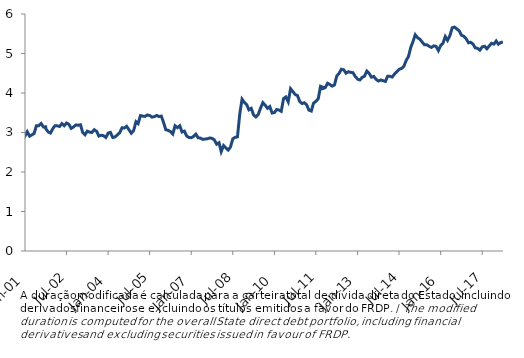
| Category | Series 0 |
|---|---|
| 2001-01-31 | 2.946 |
| 2001-02-01 | 2.916 |
| 2001-03-01 | 3.02 |
| 2001-04-01 | 2.907 |
| 2001-05-30 | 2.973 |
| 2001-06-30 | 3.172 |
| 2001-07-31 | 3.172 |
| 2001-08-31 | 3.228 |
| 2001-09-30 | 3.14 |
| 2001-10-30 | 3.143 |
| 2001-11-01 | 3.096 |
| 2001-12-01 | 3.015 |
| 2002-01-01 | 2.985 |
| 2002-02-01 | 3.098 |
| 2002-03-01 | 3.171 |
| 2002-04-01 | 3.169 |
| 2002-05-01 | 3.152 |
| 2002-06-01 | 3.227 |
| 2002-07-01 | 3.172 |
| 2002-08-01 | 3.24 |
| 2002-09-01 | 3.207 |
| 2002-10-01 | 3.104 |
| 2002-11-01 | 3.141 |
| 2002-12-01 | 3.19 |
| 2003-01-01 | 3.184 |
| 2003-02-01 | 3.196 |
| 2003-03-01 | 3.006 |
| 2003-04-01 | 2.942 |
| 2003-05-01 | 3.035 |
| 2003-06-01 | 3.009 |
| 2003-07-01 | 3 |
| 2003-08-01 | 3.071 |
| 2003-09-01 | 3.03 |
| 2003-10-01 | 2.91 |
| 2003-11-01 | 2.931 |
| 2003-12-01 | 2.918 |
| 2004-01-01 | 2.873 |
| 2004-02-01 | 2.986 |
| 2004-03-01 | 3.003 |
| 2004-04-01 | 2.873 |
| 2004-05-01 | 2.887 |
| 2004-06-01 | 2.94 |
| 2004-07-01 | 2.993 |
| 2004-08-01 | 3.119 |
| 2004-09-01 | 3.114 |
| 2004-10-01 | 3.157 |
| 2004-11-01 | 3.067 |
| 2004-12-01 | 2.981 |
| 2005-01-01 | 3.047 |
| 2005-02-01 | 3.274 |
| 2005-03-01 | 3.226 |
| 2005-04-01 | 3.428 |
| 2005-05-01 | 3.415 |
| 2005-06-01 | 3.407 |
| 2005-07-01 | 3.444 |
| 2005-08-01 | 3.43 |
| 2005-09-01 | 3.389 |
| 2005-10-01 | 3.403 |
| 2005-11-01 | 3.433 |
| 2005-12-01 | 3.405 |
| 2006-01-01 | 3.415 |
| 2006-02-01 | 3.245 |
| 2006-03-01 | 3.071 |
| 2006-04-01 | 3.054 |
| 2006-05-01 | 3.025 |
| 2006-06-01 | 2.962 |
| 2006-07-01 | 3.169 |
| 2006-08-01 | 3.122 |
| 2006-09-01 | 3.17 |
| 2006-10-01 | 3.013 |
| 2006-11-01 | 3.034 |
| 2006-12-01 | 2.911 |
| 2007-01-01 | 2.872 |
| 2007-02-01 | 2.869 |
| 2007-03-01 | 2.9 |
| 2007-04-01 | 2.958 |
| 2007-05-01 | 2.867 |
| 2007-06-01 | 2.858 |
| 2007-07-01 | 2.826 |
| 2007-08-31 | 2.842 |
| 2007-09-30 | 2.862 |
| 2007-10-31 | 2.852 |
| 2007-11-30 | 2.814 |
| 2007-12-31 | 2.705 |
| 2008-01-31 | 2.742 |
| 2008-02-29 | 2.517 |
| 2008-03-31 | 2.668 |
| 2008-04-30 | 2.609 |
| 2008-05-31 | 2.555 |
| 2008-06-30 | 2.632 |
| 2008-07-31 | 2.84 |
| 2008-08-31 | 2.878 |
| 2008-09-30 | 2.889 |
| 2008-10-31 | 3.476 |
| 2008-11-30 | 3.843 |
| 2008-12-31 | 3.759 |
| 2009-01-31 | 3.702 |
| 2009-02-28 | 3.574 |
| 2009-03-31 | 3.612 |
| 2009-04-30 | 3.448 |
| 2009-05-31 | 3.396 |
| 2009-06-30 | 3.451 |
| 2009-07-31 | 3.614 |
| 2009-08-31 | 3.755 |
| 2009-09-30 | 3.694 |
| 2009-10-31 | 3.612 |
| 2009-11-30 | 3.656 |
| 2009-12-31 | 3.494 |
| 2010-01-31 | 3.505 |
| 2010-02-28 | 3.581 |
| 2010-03-31 | 3.57 |
| 2010-04-30 | 3.537 |
| 2010-05-31 | 3.86 |
| 2010-06-30 | 3.9 |
| 2010-07-31 | 3.778 |
| 2010-08-31 | 4.109 |
| 2010-09-30 | 4.038 |
| 2010-10-31 | 3.962 |
| 2010-11-30 | 3.935 |
| 2010-12-31 | 3.781 |
| 2011-01-31 | 3.733 |
| 2011-02-28 | 3.753 |
| 2011-03-31 | 3.702 |
| 2011-04-30 | 3.566 |
| 2011-05-31 | 3.543 |
| 2011-06-30 | 3.742 |
| 2011-07-31 | 3.789 |
| 2011-08-31 | 3.857 |
| 2011-09-30 | 4.17 |
| 2011-10-31 | 4.147 |
| 2011-11-01 | 4.114 |
| 2011-12-01 | 4.135 |
| 2012-01-01 | 4.247 |
| 2012-02-01 | 4.214 |
| 2012-03-01 | 4.174 |
| 2012-04-01 | 4.205 |
| 2012-05-01 | 4.43 |
| 2012-06-01 | 4.5 |
| 2012-07-01 | 4.601 |
| 2012-08-01 | 4.587 |
| 2012-09-01 | 4.5 |
| 2012-10-01 | 4.539 |
| 2012-11-01 | 4.522 |
| 2012-12-01 | 4.513 |
| 2013-01-01 | 4.415 |
| 2013-02-01 | 4.35 |
| 2013-03-01 | 4.331 |
| 2013-04-01 | 4.395 |
| 2013-05-01 | 4.426 |
| 2013-06-01 | 4.556 |
| 2013-07-01 | 4.499 |
| 2013-08-01 | 4.4 |
| 2013-09-01 | 4.419 |
| 2013-10-01 | 4.346 |
| 2013-11-01 | 4.303 |
| 2013-12-01 | 4.331 |
| 2014-01-01 | 4.312 |
| 2014-02-01 | 4.292 |
| 2014-03-01 | 4.422 |
| 2014-04-01 | 4.422 |
| 2014-05-01 | 4.404 |
| 2014-06-01 | 4.48 |
| 2014-07-01 | 4.536 |
| 2014-08-01 | 4.6 |
| 2014-09-01 | 4.621 |
| 2014-10-01 | 4.672 |
| 2014-11-01 | 4.822 |
| 2014-12-01 | 4.92 |
| 2015-01-01 | 5.154 |
| 2015-02-01 | 5.311 |
| 2015-03-01 | 5.474 |
| 2015-04-01 | 5.399 |
| 2015-05-01 | 5.362 |
| 2015-06-30 | 5.221 |
| 2015-07-31 | 5.221 |
| 2015-08-31 | 5.182 |
| 2015-09-30 | 5.153 |
| 2015-10-31 | 5.194 |
| 2015-11-30 | 5.181 |
| 2015-12-31 | 5.074 |
| 2016-01-31 | 5.208 |
| 2016-02-29 | 5.256 |
| 2016-03-31 | 5.429 |
| 2016-04-30 | 5.332 |
| 2016-05-31 | 5.453 |
| 2016-06-30 | 5.651 |
| 2016-07-31 | 5.668 |
| 2016-08-31 | 5.62 |
| 2016-09-30 | 5.574 |
| 2016-10-31 | 5.461 |
| 2016-11-30 | 5.438 |
| 2016-12-31 | 5.373 |
| 2017-01-31 | 5.271 |
| 2017-02-28 | 5.285 |
| 2017-03-31 | 5.24 |
| 2017-04-30 | 5.143 |
| 2017-05-31 | 5.131 |
| 2017-06-30 | 5.085 |
| 2017-07-31 | 5.169 |
| 2017-08-31 | 5.184 |
| 2017-09-30 | 5.119 |
| 2017-10-31 | 5.192 |
| 2017-11-30 | 5.259 |
| 2017-12-31 | 5.237 |
| 2018-01-31 | 5.316 |
| 2018-02-28 | 5.236 |
| 2018-03-31 | 5.276 |
| 2018-04-30 | 5.29 |